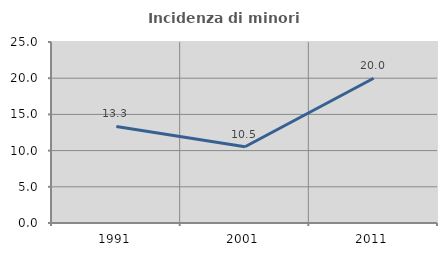
| Category | Incidenza di minori stranieri |
|---|---|
| 1991.0 | 13.333 |
| 2001.0 | 10.526 |
| 2011.0 | 20 |